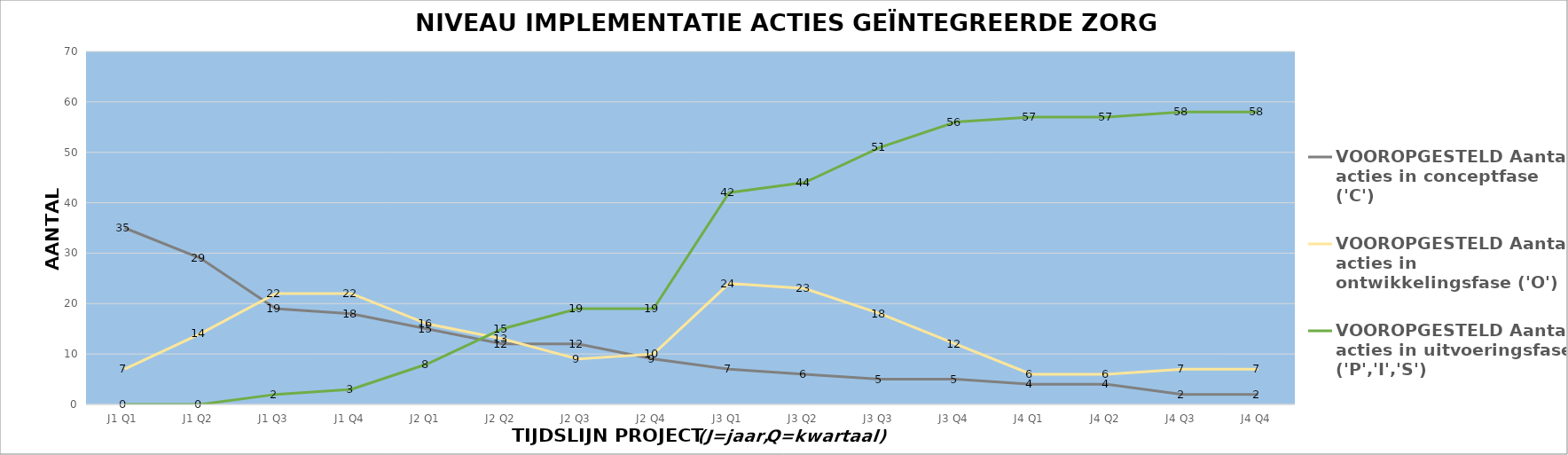
| Category | VOOROPGESTELD Aantal acties in conceptfase ('C') | VOOROPGESTELD Aantal acties in ontwikkelingsfase ('O') | VOOROPGESTELD Aantal acties in uitvoeringsfase ('P','I','S') |
|---|---|---|---|
| J1 Q1 | 35 | 7 | 0 |
| J1 Q2 | 29 | 14 | 0 |
| J1 Q3 | 19 | 22 | 2 |
| J1 Q4 | 18 | 22 | 3 |
| J2 Q1 | 15 | 16 | 8 |
| J2 Q2 | 12 | 13 | 15 |
| J2 Q3 | 12 | 9 | 19 |
| J2 Q4 | 9 | 10 | 19 |
| J3 Q1 | 7 | 24 | 42 |
| J3 Q2 | 6 | 23 | 44 |
| J3 Q3 | 5 | 18 | 51 |
| J3 Q4 | 5 | 12 | 56 |
| J4 Q1 | 4 | 6 | 57 |
| J4 Q2 | 4 | 6 | 57 |
| J4 Q3 | 2 | 7 | 58 |
| J4 Q4 | 2 | 7 | 58 |